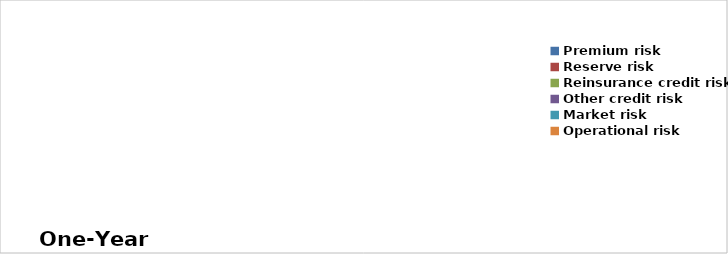
| Category | Form 309 Post-Diversification Risks |
|---|---|
| Premium risk  | 0 |
| Reserve risk | 0 |
| Reinsurance credit risk | 0 |
| Other credit risk | 0 |
| Market risk | 0 |
| Operational risk | 0 |